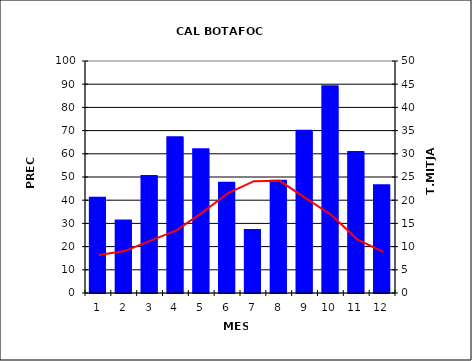
| Category | Series 0 |
|---|---|
| 0 | 41.006 |
| 1 | 31.256 |
| 2 | 50.387 |
| 3 | 67.119 |
| 4 | 61.941 |
| 5 | 47.522 |
| 6 | 27.125 |
| 7 | 48.353 |
| 8 | 69.909 |
| 9 | 89.156 |
| 10 | 60.828 |
| 11 | 46.473 |